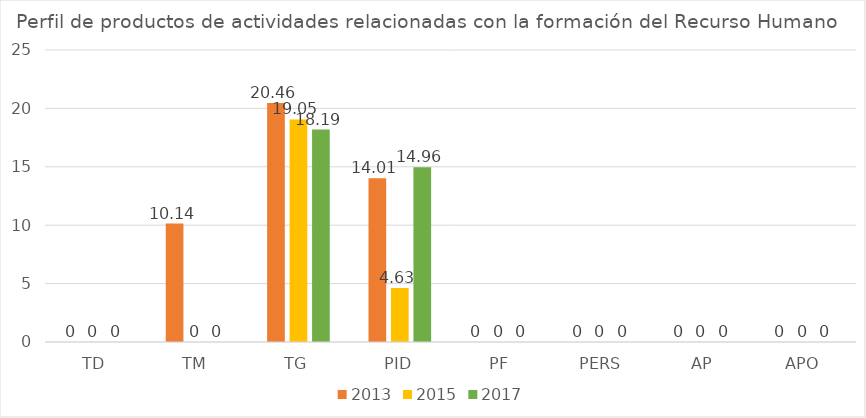
| Category | 2013 | 2015 | 2017 |
|---|---|---|---|
| TD | 0 | 0 | 0 |
| TM | 10.14 | 0 | 0 |
| TG | 20.46 | 19.05 | 18.19 |
| PID | 14.01 | 4.63 | 14.96 |
| PF | 0 | 0 | 0 |
| PERS | 0 | 0 | 0 |
| AP | 0 | 0 | 0 |
| APO | 0 | 0 | 0 |